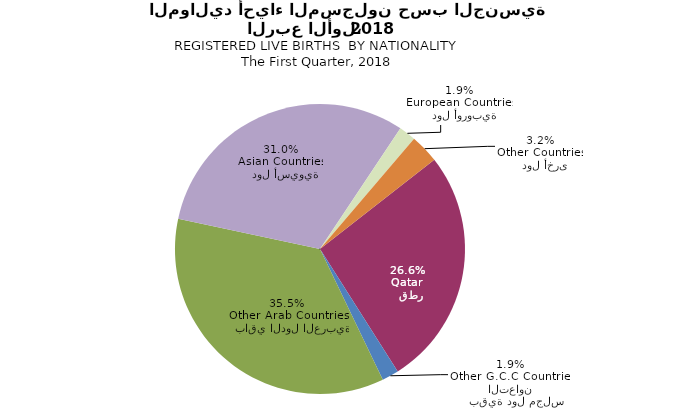
| Category | Series 0 |
|---|---|
|   قطر
Qatar | 1712 |
|   بقية دول مجلس التعاون
Other G.C.C Countries | 121 |
|   باقي الدول العربية
Other Arab Countries | 2287 |
|   دول أسيوية
Asian Countries | 2000 |
|   دول أوروبية
European Countries | 121 |
|   دول أخرى
Other Countries | 207 |